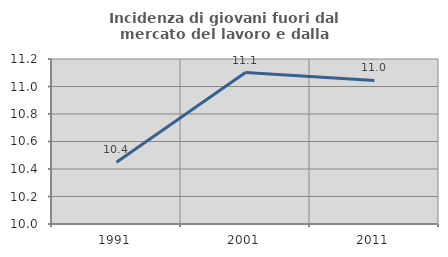
| Category | Incidenza di giovani fuori dal mercato del lavoro e dalla formazione  |
|---|---|
| 1991.0 | 10.448 |
| 2001.0 | 11.101 |
| 2011.0 | 11.044 |